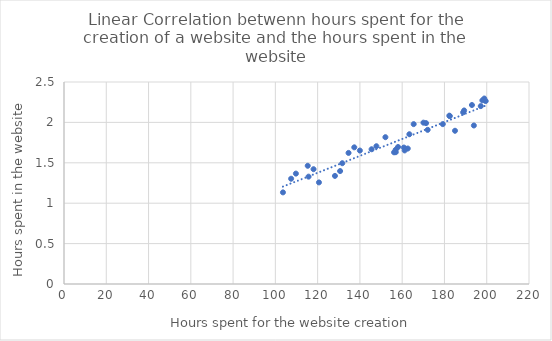
| Category | Hours spent in the website |
|---|---|
| 158.0393497087358 | 1.695 |
| 197.18368301107745 | 2.202 |
| 120.6267872032713 | 1.257 |
| 107.45706395929709 | 1.303 |
| 179.22108951652507 | 1.979 |
| 165.44176124913875 | 1.979 |
| 131.6599789267661 | 1.495 |
| 193.00194245721792 | 2.215 |
| 160.81132412327787 | 1.689 |
| 147.7991747498799 | 1.705 |
| 163.39441093398736 | 1.854 |
| 199.51393474413348 | 2.264 |
| 162.6412100919973 | 1.677 |
| 156.93959984362283 | 1.661 |
| 193.91723166223022 | 1.962 |
| 137.33521281763842 | 1.691 |
| 118.06613726047772 | 1.421 |
| 134.62302632868008 | 1.622 |
| 115.3178192520628 | 1.463 |
| 156.95848199328927 | 1.631 |
| 145.52341527178203 | 1.668 |
| 115.70938148625876 | 1.329 |
| 152.06332842624658 | 1.817 |
| 109.71762786574446 | 1.366 |
| 198.8513243328222 | 2.296 |
| 182.51898096335182 | 2.078 |
| 103.59558120203228 | 1.134 |
| 156.15448777787606 | 1.63 |
| 182.3210532741488 | 2.084 |
| 161.15973473355766 | 1.653 |
| 172.05368508572997 | 1.908 |
| 128.19146462486268 | 1.338 |
| 197.9401634892924 | 2.273 |
| 171.2924069035197 | 1.991 |
| 184.99043136940531 | 1.897 |
| 139.9827356425667 | 1.652 |
| 170.06463760161301 | 1.997 |
| 189.31363626791403 | 2.148 |
| 188.84420571332458 | 2.124 |
| 130.63267537035736 | 1.398 |